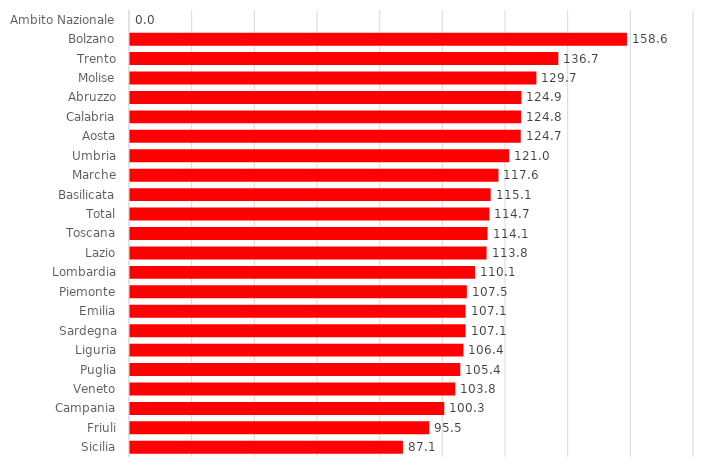
| Category | Series 0 |
|---|---|
| Ambito Nazionale | 0 |
| Bolzano | 158.6 |
| Trento | 136.7 |
| Molise | 129.7 |
| Abruzzo | 124.9 |
| Calabria | 124.8 |
| Aosta | 124.7 |
| Umbria | 121 |
| Marche | 117.6 |
| Basilicata | 115.1 |
| Total | 114.7 |
| Toscana | 114.1 |
| Lazio | 113.8 |
| Lombardia | 110.1 |
| Piemonte | 107.5 |
| Emilia | 107.1 |
| Sardegna | 107.1 |
| Liguria | 106.4 |
| Puglia | 105.4 |
| Veneto | 103.8 |
| Campania | 100.3 |
| Friuli | 95.5 |
| Sicilia | 87.1 |